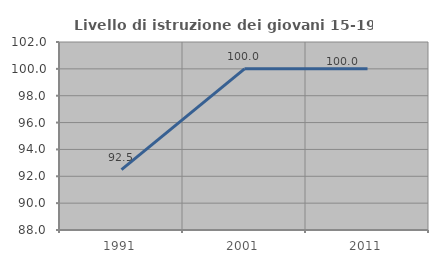
| Category | Livello di istruzione dei giovani 15-19 anni |
|---|---|
| 1991.0 | 92.5 |
| 2001.0 | 100 |
| 2011.0 | 100 |